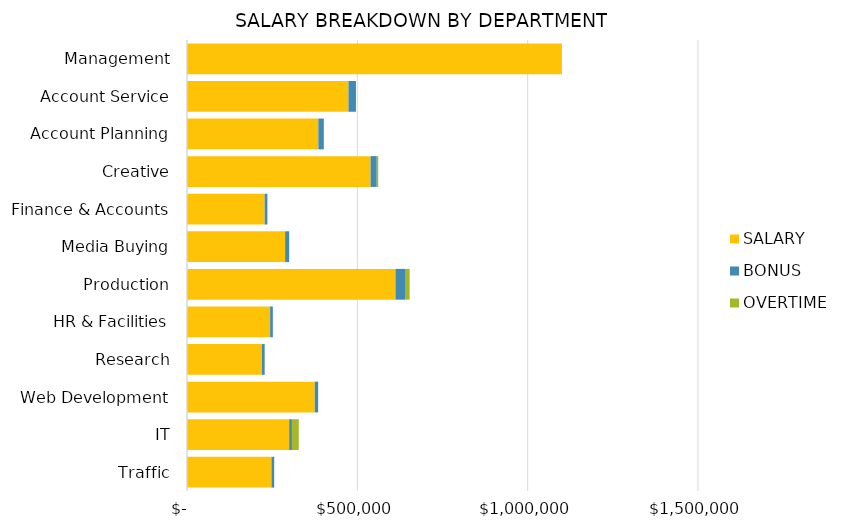
| Category | SALARY | BONUS | OVERTIME |
|---|---|---|---|
| Management | 1100591 | 0 | 0 |
| Account Service | 474000 | 22000 | 0 |
| Account Planning | 385600 | 16000 | 0 |
| Creative | 539000 | 18000 | 4400 |
| Finance & Accounts | 228000 | 8000 | 0 |
| Media Buying | 288000 | 12000 | 0 |
| Production | 612000 | 28000 | 13500 |
| HR & Facilities | 244000 | 8000 | 0 |
| Research | 220000 | 8000 | 0 |
| Web Development | 375000 | 10000 | 0 |
| IT | 300000 | 8000 | 20000 |
| Traffic | 248000 | 8000 | 0 |